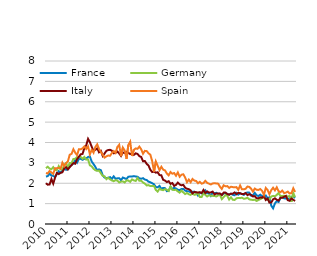
| Category | France | Germany | Italy | Spain |
|---|---|---|---|---|
| 2010-01-31 | 2.33 | 2.74 | 2 | 2.5 |
| 2010-02-28 | 2.35 | 2.81 | 1.93 | 2.48 |
| 2010-03-31 | 2.47 | 2.72 | 1.94 | 2.6 |
| 2010-04-30 | 2.38 | 2.69 | 2.21 | 2.53 |
| 2010-05-31 | 2.36 | 2.79 | 1.98 | 2.46 |
| 2010-06-30 | 2.31 | 2.65 | 2.28 | 2.74 |
| 2010-07-31 | 2.45 | 2.65 | 2.51 | 2.74 |
| 2010-08-31 | 2.59 | 2.84 | 2.45 | 2.76 |
| 2010-09-30 | 2.52 | 2.68 | 2.51 | 2.71 |
| 2010-10-31 | 2.63 | 2.67 | 2.54 | 3.01 |
| 2010-11-30 | 2.7 | 2.91 | 2.73 | 2.84 |
| 2010-12-31 | 2.66 | 2.99 | 2.79 | 2.98 |
| 2011-01-31 | 2.68 | 2.77 | 2.68 | 3.08 |
| 2011-02-28 | 2.83 | 3 | 2.79 | 3.4 |
| 2011-03-31 | 2.9 | 3 | 2.89 | 3.44 |
| 2011-04-30 | 2.97 | 3.19 | 2.99 | 3.67 |
| 2011-05-31 | 3.13 | 3.2 | 2.96 | 3.5 |
| 2011-06-30 | 3.01 | 3.29 | 3.18 | 3.38 |
| 2011-07-31 | 3.2 | 3.27 | 3.3 | 3.67 |
| 2011-08-31 | 3.2 | 3.29 | 3.42 | 3.67 |
| 2011-09-30 | 3.15 | 3.2 | 3.44 | 3.71 |
| 2011-10-31 | 3.2 | 3.29 | 3.73 | 3.81 |
| 2011-11-30 | 3.21 | 3.16 | 3.86 | 3.68 |
| 2011-12-31 | 3.29 | 3.17 | 4.18 | 3.81 |
| 2012-01-31 | 3.31 | 2.88 | 4.02 | 3.42 |
| 2012-02-29 | 3.06 | 2.83 | 3.79 | 3.64 |
| 2012-03-31 | 2.94 | 2.71 | 3.58 | 3.5 |
| 2012-04-30 | 2.8 | 2.64 | 3.64 | 3.78 |
| 2012-05-31 | 2.64 | 2.61 | 3.71 | 3.91 |
| 2012-06-30 | 2.68 | 2.62 | 3.52 | 3.68 |
| 2012-07-31 | 2.64 | 2.49 | 3.59 | 3.53 |
| 2012-08-31 | 2.39 | 2.36 | 3.34 | 3.4 |
| 2012-09-30 | 2.28 | 2.34 | 3.46 | 3.26 |
| 2012-10-31 | 2.25 | 2.2 | 3.59 | 3.32 |
| 2012-11-30 | 2.27 | 2.27 | 3.63 | 3.36 |
| 2012-12-31 | 2.3 | 2.19 | 3.64 | 3.35 |
| 2013-01-31 | 2.21 | 2.14 | 3.6 | 3.48 |
| 2013-02-28 | 2.34 | 2.1 | 3.47 | 3.58 |
| 2013-03-31 | 2.22 | 2.15 | 3.49 | 3.49 |
| 2013-04-30 | 2.24 | 2.13 | 3.56 | 3.78 |
| 2013-05-31 | 2.25 | 2.04 | 3.46 | 3.89 |
| 2013-06-30 | 2.15 | 2.08 | 3.34 | 3.33 |
| 2013-07-31 | 2.28 | 2.09 | 3.51 | 3.75 |
| 2013-08-31 | 2.24 | 2.04 | 3.48 | 3.61 |
| 2013-09-30 | 2.21 | 2.14 | 3.54 | 3.2 |
| 2013-10-31 | 2.32 | 2.13 | 3.49 | 3.88 |
| 2013-11-30 | 2.33 | 2.07 | 3.43 | 4.04 |
| 2013-12-31 | 2.33 | 2.19 | 3.45 | 3.34 |
| 2014-01-31 | 2.35 | 2.14 | 3.39 | 3.64 |
| 2014-02-28 | 2.33 | 2.11 | 3.47 | 3.71 |
| 2014-03-31 | 2.32 | 2.26 | 3.44 | 3.69 |
| 2014-04-30 | 2.24 | 2.12 | 3.33 | 3.8 |
| 2014-05-31 | 2.22 | 2.13 | 3.29 | 3.67 |
| 2014-06-30 | 2.25 | 2.04 | 3.08 | 3.45 |
| 2014-07-31 | 2.18 | 1.98 | 3.09 | 3.59 |
| 2014-08-31 | 2.16 | 1.89 | 2.95 | 3.58 |
| 2014-09-30 | 2.08 | 1.91 | 2.87 | 3.47 |
| 2014-10-31 | 2.05 | 1.86 | 2.66 | 3.4 |
| 2014-11-30 | 2 | 1.87 | 2.55 | 3.09 |
| 2014-12-31 | 1.95 | 1.87 | 2.57 | 2.57 |
| 2015-01-31 | 1.81 | 1.67 | 2.52 | 3.07 |
| 2015-02-28 | 1.8 | 1.59 | 2.54 | 2.86 |
| 2015-03-31 | 1.87 | 1.73 | 2.4 | 2.64 |
| 2015-04-30 | 1.72 | 1.68 | 2.39 | 2.81 |
| 2015-05-31 | 1.77 | 1.66 | 2.17 | 2.67 |
| 2015-06-30 | 1.76 | 1.71 | 2.13 | 2.63 |
| 2015-07-31 | 1.61 | 1.68 | 2.06 | 2.48 |
| 2015-08-31 | 1.63 | 1.62 | 2.1 | 2.39 |
| 2015-09-30 | 1.83 | 1.84 | 1.97 | 2.55 |
| 2015-10-31 | 1.71 | 1.68 | 2.01 | 2.47 |
| 2015-11-30 | 1.78 | 1.67 | 1.87 | 2.5 |
| 2015-12-31 | 1.74 | 1.68 | 1.92 | 2.37 |
| 2016-01-31 | 1.68 | 1.6 | 2.03 | 2.53 |
| 2016-02-29 | 1.66 | 1.54 | 1.94 | 2.32 |
| 2016-03-31 | 1.72 | 1.64 | 1.9 | 2.42 |
| 2016-04-30 | 1.72 | 1.55 | 1.92 | 2.44 |
| 2016-05-31 | 1.64 | 1.47 | 1.78 | 2.28 |
| 2016-06-30 | 1.61 | 1.52 | 1.73 | 2.05 |
| 2016-07-31 | 1.6 | 1.46 | 1.71 | 2.18 |
| 2016-08-31 | 1.56 | 1.43 | 1.65 | 2.05 |
| 2016-09-30 | 1.58 | 1.51 | 1.5 | 2.21 |
| 2016-10-31 | 1.59 | 1.43 | 1.57 | 2.13 |
| 2016-11-30 | 1.54 | 1.45 | 1.56 | 2.11 |
| 2016-12-31 | 1.4 | 1.53 | 1.54 | 2 |
| 2017-01-31 | 1.54 | 1.33 | 1.56 | 2.07 |
| 2017-02-28 | 1.5 | 1.33 | 1.52 | 1.98 |
| 2017-03-31 | 1.52 | 1.5 | 1.67 | 2.01 |
| 2017-04-30 | 1.65 | 1.43 | 1.52 | 2.12 |
| 2017-05-31 | 1.51 | 1.35 | 1.6 | 2.02 |
| 2017-06-30 | 1.5 | 1.41 | 1.54 | 1.98 |
| 2017-07-31 | 1.38 | 1.39 | 1.55 | 1.94 |
| 2017-08-31 | 1.54 | 1.38 | 1.59 | 1.99 |
| 2017-09-30 | 1.51 | 1.38 | 1.45 | 2 |
| 2017-10-31 | 1.53 | 1.35 | 1.5 | 1.99 |
| 2017-11-30 | 1.48 | 1.4 | 1.49 | 1.98 |
| 2017-12-31 | 1.48 | 1.43 | 1.5 | 1.83 |
| 2018-01-31 | 1.43 | 1.22 | 1.42 | 1.72 |
| 2018-02-28 | 1.5 | 1.32 | 1.54 | 1.9 |
| 2018-03-31 | 1.52 | 1.42 | 1.54 | 1.85 |
| 2018-04-30 | 1.48 | 1.39 | 1.47 | 1.86 |
| 2018-05-31 | 1.44 | 1.2 | 1.44 | 1.77 |
| 2018-06-30 | 1.49 | 1.31 | 1.49 | 1.83 |
| 2018-07-31 | 1.43 | 1.19 | 1.49 | 1.81 |
| 2018-08-31 | 1.41 | 1.18 | 1.55 | 1.8 |
| 2018-09-30 | 1.52 | 1.26 | 1.46 | 1.81 |
| 2018-10-31 | 1.44 | 1.28 | 1.53 | 1.68 |
| 2018-11-30 | 1.51 | 1.27 | 1.51 | 1.89 |
| 2018-12-31 | 1.47 | 1.29 | 1.47 | 1.7 |
| 2019-01-31 | 1.43 | 1.24 | 1.47 | 1.7 |
| 2019-02-28 | 1.52 | 1.25 | 1.52 | 1.73 |
| 2019-03-31 | 1.55 | 1.29 | 1.42 | 1.84 |
| 2019-04-30 | 1.54 | 1.21 | 1.46 | 1.82 |
| 2019-05-31 | 1.39 | 1.19 | 1.43 | 1.73 |
| 2019-06-30 | 1.41 | 1.18 | 1.35 | 1.59 |
| 2019-07-31 | 1.53 | 1.19 | 1.37 | 1.74 |
| 2019-08-31 | 1.41 | 1.13 | 1.26 | 1.68 |
| 2019-09-30 | 1.37 | 1.18 | 1.26 | 1.67 |
| 2019-10-31 | 1.44 | 1.22 | 1.31 | 1.72 |
| 2019-11-30 | 1.37 | 1.27 | 1.29 | 1.63 |
| 2019-12-31 | 1.36 | 1.29 | 1.37 | 1.43 |
| 2020-01-31 | 1.4 | 1.24 | 1.18 | 1.77 |
| 2020-02-29 | 1.27 | 1.19 | 1.25 | 1.67 |
| 2020-03-31 | 1.31 | 1.2 | 1.05 | 1.46 |
| 2020-04-30 | 0.9 | 1.35 | 1.06 | 1.66 |
| 2020-05-31 | 0.77 | 1.38 | 1.21 | 1.78 |
| 2020-06-30 | 1.01 | 1.36 | 1.26 | 1.65 |
| 2020-07-31 | 1.12 | 1.43 | 1.19 | 1.8 |
| 2020-08-31 | 1.08 | 1.52 | 1.15 | 1.61 |
| 2020-09-30 | 1.28 | 1.37 | 1.29 | 1.56 |
| 2020-10-31 | 1.31 | 1.37 | 1.29 | 1.64 |
| 2020-11-30 | 1.26 | 1.39 | 1.33 | 1.52 |
| 2020-12-31 | 1.25 | 1.33 | 1.38 | 1.54 |
| 2021-01-31 | 1.25 | 1.36 | 1.17 | 1.59 |
| 2021-02-28 | 1.24 | 1.37 | 1.14 | 1.5 |
| 2021-03-31 | 1.33 | 1.09 | 1.25 | 1.51 |
| 2021-04-30 | 1.36 | 1.52 | 1.19 | 1.75 |
| 2021-05-31 | 1.28 | 1.32 | 1.13 | 1.57 |